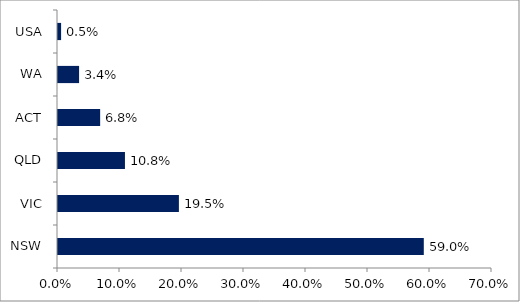
| Category | Series 0 |
|---|---|
| NSW | 0.59 |
| VIC | 0.195 |
| QLD | 0.108 |
| ACT | 0.068 |
| WA | 0.034 |
| USA | 0.005 |